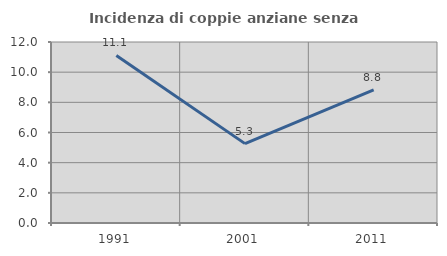
| Category | Incidenza di coppie anziane senza figli  |
|---|---|
| 1991.0 | 11.111 |
| 2001.0 | 5.263 |
| 2011.0 | 8.824 |